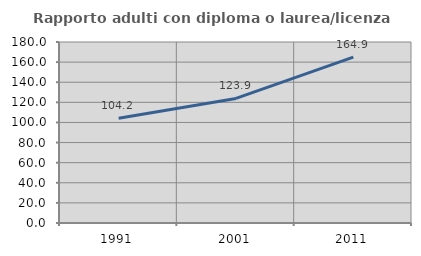
| Category | Rapporto adulti con diploma o laurea/licenza media  |
|---|---|
| 1991.0 | 104.245 |
| 2001.0 | 123.863 |
| 2011.0 | 164.895 |